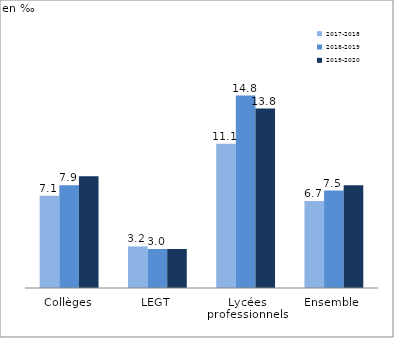
| Category | 2017-2018 | 2018-2019 | 2019-2020 |
|---|---|---|---|
| Collèges | 7.1 | 7.9 | 8.6 |
| LEGT | 3.2 | 3 | 3 |
| Lycées professionnels | 11.1 | 14.8 | 13.8 |
| Ensemble  | 6.7 | 7.5 | 7.9 |